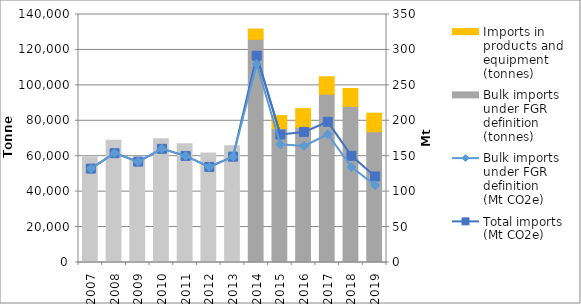
| Category | Bulk imports under FGR definition 
(tonnes) | Imports in products and equipment 
(tonnes) |
|---|---|---|
| 2007.0 | 59518.488 | 0 |
| 2008.0 | 68948.237 | 0 |
| 2009.0 | 58746.203 | 0 |
| 2010.0 | 69858.093 | 0 |
| 2011.0 | 67093.941 | 0 |
| 2012.0 | 61786.639 | 0 |
| 2013.0 | 65859.096 | 0 |
| 2014.0 | 125985.601 | 5808.172 |
| 2015.0 | 75605.988 | 7303.606 |
| 2016.0 | 76247.129 | 10630.9 |
| 2017.0 | 95012.552 | 9822.568 |
| 2018.0 | 88140.104 | 10082.905 |
| 2019.0 | 73825.225 | 10458.932 |